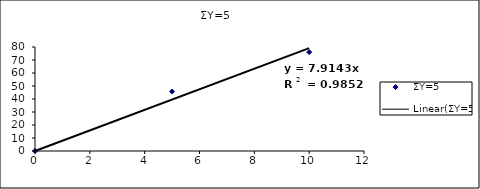
| Category | ΣΥ=5 |
|---|---|
| 0.0 | 0 |
| 5.0 | 45.714 |
| 10.0 | 76.071 |